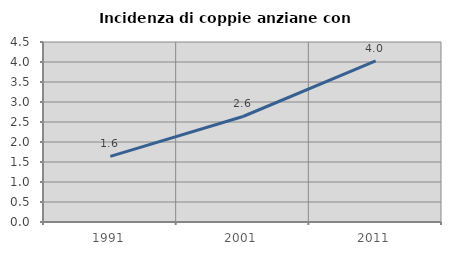
| Category | Incidenza di coppie anziane con figli |
|---|---|
| 1991.0 | 1.639 |
| 2001.0 | 2.638 |
| 2011.0 | 4.026 |